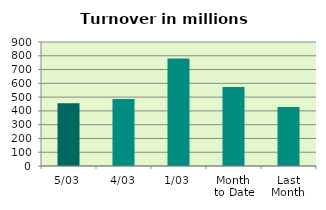
| Category | Series 0 |
|---|---|
| 5/03 | 455.85 |
| 4/03 | 486.363 |
| 1/03 | 779.695 |
| Month 
to Date | 573.969 |
| Last
Month | 428.598 |